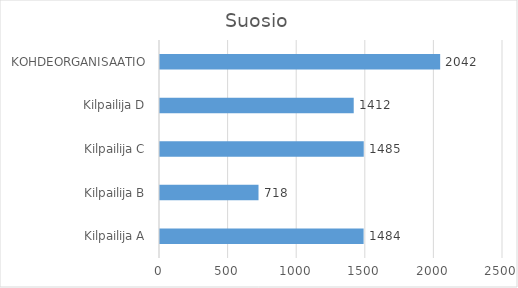
| Category | Series 0 |
|---|---|
| Kilpailija A | 1484 |
| Kilpailija B | 718 |
| Kilpailija C | 1485 |
| Kilpailija D | 1412 |
| KOHDEORGANISAATIO | 2042 |